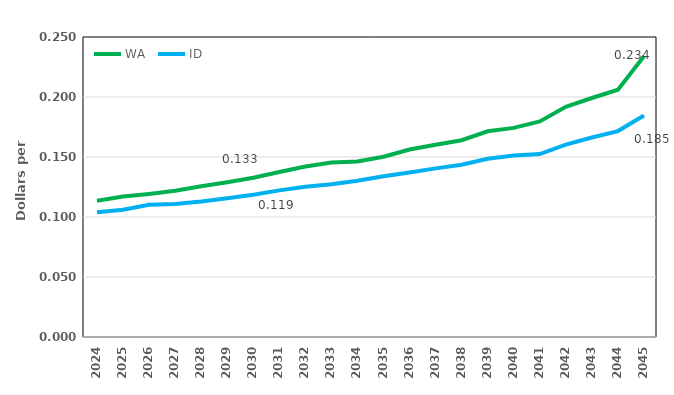
| Category | WA | ID |
|---|---|---|
| 2024.0 | 0.114 | 0.104 |
| 2025.0 | 0.117 | 0.106 |
| 2026.0 | 0.119 | 0.11 |
| 2027.0 | 0.122 | 0.111 |
| 2028.0 | 0.126 | 0.113 |
| 2029.0 | 0.129 | 0.116 |
| 2030.0 | 0.133 | 0.119 |
| 2031.0 | 0.137 | 0.122 |
| 2032.0 | 0.142 | 0.125 |
| 2033.0 | 0.145 | 0.127 |
| 2034.0 | 0.146 | 0.13 |
| 2035.0 | 0.15 | 0.134 |
| 2036.0 | 0.156 | 0.137 |
| 2037.0 | 0.16 | 0.141 |
| 2038.0 | 0.164 | 0.144 |
| 2039.0 | 0.171 | 0.149 |
| 2040.0 | 0.174 | 0.151 |
| 2041.0 | 0.18 | 0.152 |
| 2042.0 | 0.192 | 0.16 |
| 2043.0 | 0.199 | 0.166 |
| 2044.0 | 0.206 | 0.172 |
| 2045.0 | 0.234 | 0.185 |